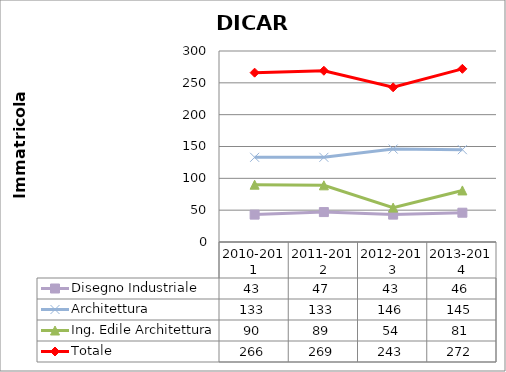
| Category | Disegno Industriale | Architettura | Ing. Edile Architettura | Totale |
|---|---|---|---|---|
| 2010-2011 | 43 | 133 | 90 | 266 |
| 2011-2012 | 47 | 133 | 89 | 269 |
| 2012-2013 | 43 | 146 | 54 | 243 |
| 2013-2014 | 46 | 145 | 81 | 272 |